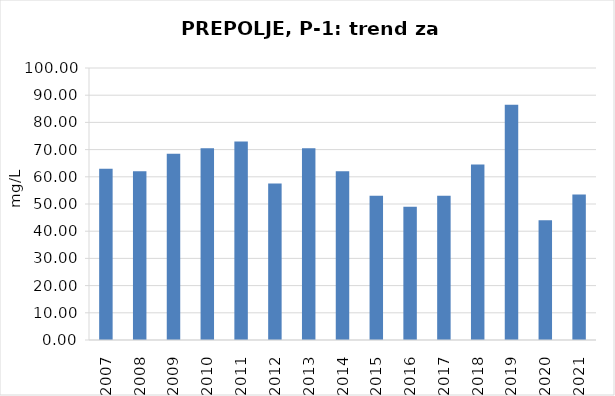
| Category | Vsota |
|---|---|
| 2007 | 63 |
| 2008 | 62 |
| 2009 | 68.5 |
| 2010 | 70.5 |
| 2011 | 73 |
| 2012 | 57.5 |
| 2013 | 70.5 |
| 2014 | 62 |
| 2015 | 53 |
| 2016 | 49 |
| 2017 | 53 |
| 2018 | 64.5 |
| 2019 | 86.5 |
| 2020 | 44 |
| 2021 | 53.5 |